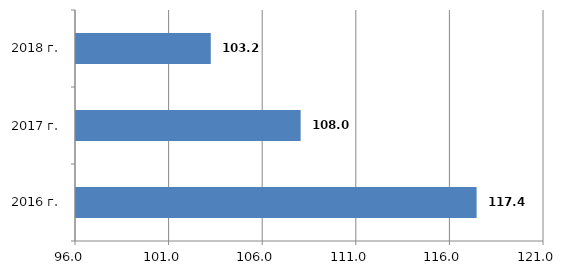
| Category | Series 0 |
|---|---|
| 2016 г. | 117.4 |
| 2017 г. | 108 |
| 2018 г. | 103.2 |